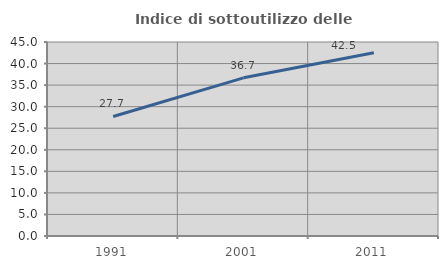
| Category | Indice di sottoutilizzo delle abitazioni  |
|---|---|
| 1991.0 | 27.733 |
| 2001.0 | 36.685 |
| 2011.0 | 42.507 |